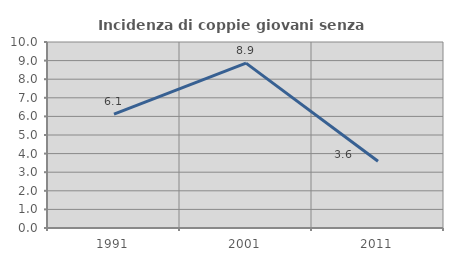
| Category | Incidenza di coppie giovani senza figli |
|---|---|
| 1991.0 | 6.122 |
| 2001.0 | 8.864 |
| 2011.0 | 3.586 |